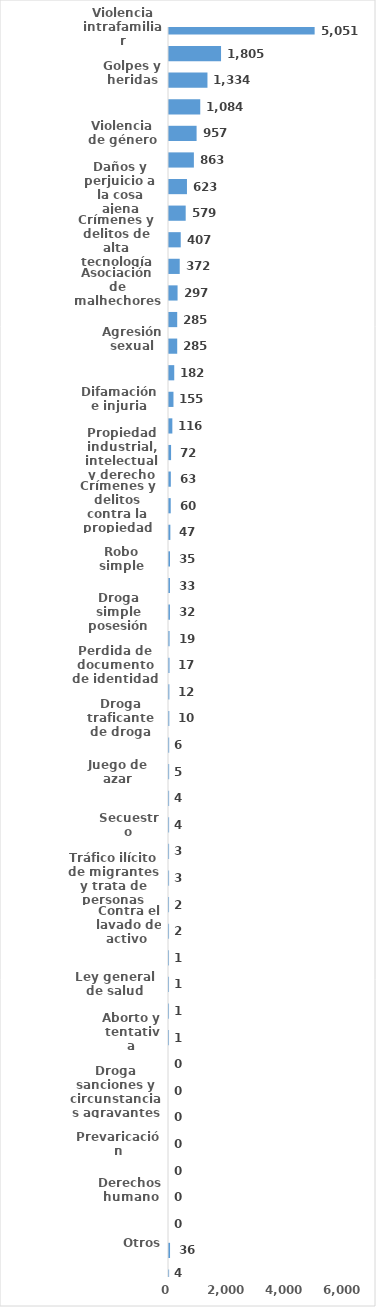
| Category | Series 0 |
|---|---|
| Violencia intrafamiliar | 5051 |
| Amenaza | 1805 |
| Golpes y heridas | 1334 |
| Código del menor NNA | 1084 |
| Violencia de género | 957 |
| Robo calificado | 863 |
| Daños y perjuicio a la cosa ajena | 623 |
| Abuso de confianza | 579 |
| Crímenes y delitos de alta tecnología | 407 |
| Estafa | 372 |
| Asociación de malhechores | 297 |
| Código del trabajo | 285 |
| Agresión sexual | 285 |
| Ley de Armas | 182 |
| Difamación e injuria | 155 |
| Falsificación | 116 |
| Propiedad industrial, intelectual y derecho de autor | 72 |
| Homicidio | 63 |
| Crímenes y delitos contra la propiedad | 60 |
| Tentativa de homicidio | 47 |
| Robo simple | 35 |
| Protección Animal y Tenencia Responsable | 33 |
| Droga simple posesión | 32 |
| Violación sexual | 19 |
| Perdida de documento de identidad | 17 |
| Ley de cheque | 12 |
| Droga traficante de droga | 10 |
| Tránsito y seguridad vial  | 6 |
| Juego de azar | 5 |
| Medio ambiente y recursos naturales | 4 |
| Secuestro | 4 |
| Droga distribución de droga | 3 |
| Tráfico ilícito de migrantes y trata de personas | 3 |
| Desaparición | 2 |
| Contra el lavado de activo  | 2 |
| Desfalco | 1 |
| Ley general de salud | 1 |
| Terrorismo | 1 |
| Aborto y tentativa | 1 |
| Conflictos sociales | 0 |
| Droga sanciones y circunstancias agravantes | 0 |
| Soborno | 0 |
| Prevaricación | 0 |
| Proxeneta | 0 |
| Derechos humano | 0 |
| Droga delitos y sanciones | 0 |
| Otros | 36 |
| Indeterminados | 4 |